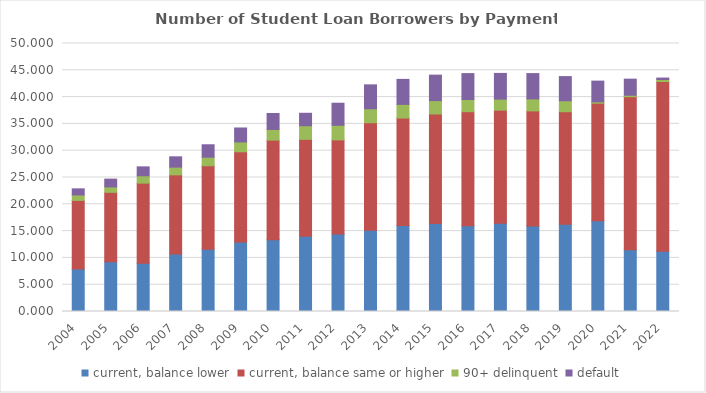
| Category | current, balance lower | current, balance same or higher | 90+ delinquent | default |
|---|---|---|---|---|
| 2004.0 | 7.93 | 12.796 | 1.018 | 1.139 |
| 2005.0 | 9.275 | 12.954 | 1.018 | 1.447 |
| 2006.0 | 8.998 | 14.956 | 1.368 | 1.663 |
| 2007.0 | 10.723 | 14.774 | 1.435 | 1.926 |
| 2008.0 | 11.624 | 15.566 | 1.597 | 2.321 |
| 2009.0 | 12.953 | 16.842 | 1.839 | 2.605 |
| 2010.0 | 13.376 | 18.592 | 2.002 | 2.967 |
| 2011.0 | 14.062 | 18.055 | 2.54 | 2.324 |
| 2012.0 | 14.462 | 17.556 | 2.721 | 4.115 |
| 2013.0 | 15.163 | 20.053 | 2.607 | 4.462 |
| 2014.0 | 16.026 | 20.067 | 2.546 | 4.666 |
| 2015.0 | 16.432 | 20.419 | 2.489 | 4.757 |
| 2016.0 | 15.994 | 21.28 | 2.283 | 4.827 |
| 2017.0 | 16.464 | 21.096 | 2.06 | 4.799 |
| 2018.0 | 15.967 | 21.457 | 2.24 | 4.722 |
| 2019.0 | 16.263 | 21.007 | 2.043 | 4.514 |
| 2020.0 | 16.953 | 21.91 | 0.255 | 3.865 |
| 2021.0 | 11.517 | 28.556 | 0.27 | 3.004 |
| 2022.0 | 11.246 | 31.668 | 0.368 | 0.271 |